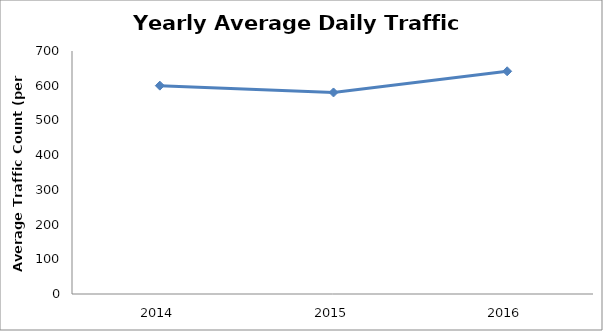
| Category | Series 0 |
|---|---|
| 2014.0 | 600.211 |
| 2015.0 | 580.559 |
| 2016.0 | 641.552 |